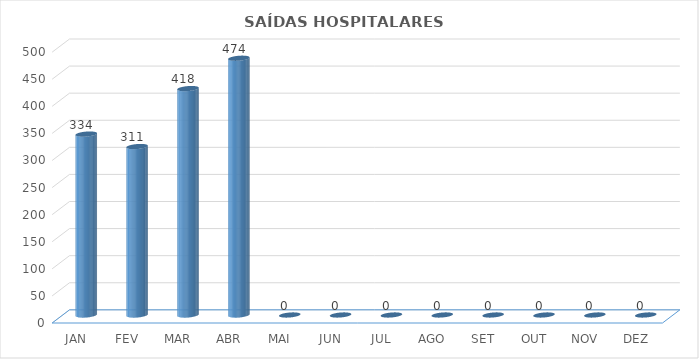
| Category | Series 0 |
|---|---|
| JAN | 334 |
| FEV | 311 |
| MAR | 418 |
| ABR | 474 |
| MAI | 0 |
| JUN | 0 |
| JUL | 0 |
| AGO | 0 |
| SET | 0 |
| OUT | 0 |
| NOV | 0 |
| DEZ | 0 |